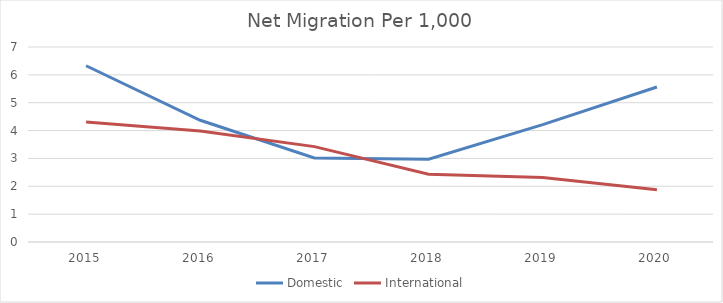
| Category | Domestic | International |
|---|---|---|
| 2015.0 | 6.327 | 4.309 |
| 2016.0 | 4.369 | 3.986 |
| 2017.0 | 3.018 | 3.424 |
| 2018.0 | 2.974 | 2.429 |
| 2019.0 | 4.215 | 2.319 |
| 2020.0 | 5.563 | 1.873 |